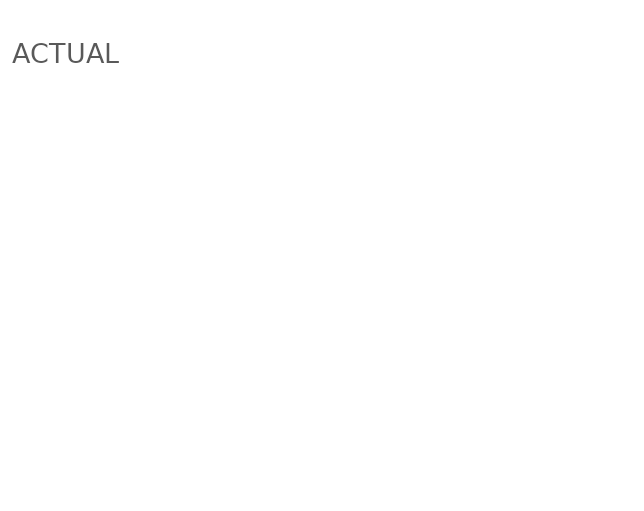
| Category | ACTUAL |
|---|---|
| EMPLOYMENT - PERMANENT | 0 |
| EMPLOYMENT - CASUAL | 0 |
| GENERAL/ADMIN | 0 |
| OPERATIONS | 0 |
| MARKETING/PROMO | 0 |
| WEBSITE/MOBILE APP | 0 |
| OCCUPANCY | 0 |
| AUTOMOTIVE | 0 |
| ADDITIONAL | 0 |